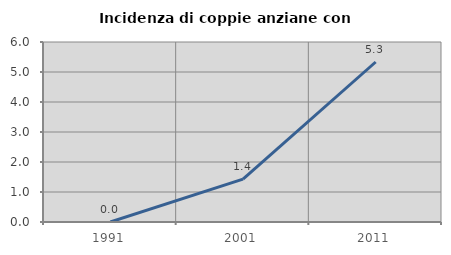
| Category | Incidenza di coppie anziane con figli |
|---|---|
| 1991.0 | 0 |
| 2001.0 | 1.429 |
| 2011.0 | 5.333 |